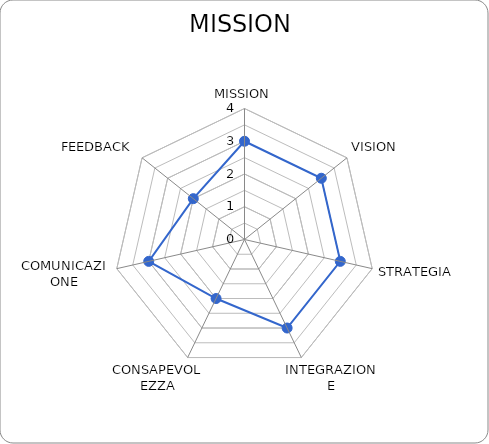
| Category | Series 0 |
|---|---|
| MISSION | 3 |
| VISION | 3 |
| STRATEGIA | 3 |
| INTEGRAZIONE | 3 |
| CONSAPEVOLEZZA | 2 |
| COMUNICAZIONE | 3 |
| FEEDBACK | 2 |